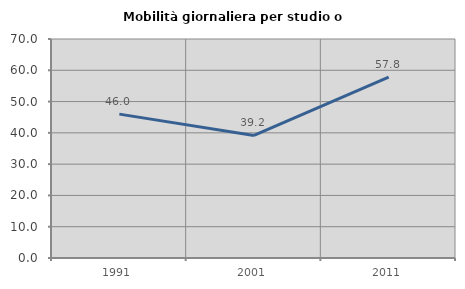
| Category | Mobilità giornaliera per studio o lavoro |
|---|---|
| 1991.0 | 45.989 |
| 2001.0 | 39.189 |
| 2011.0 | 57.812 |